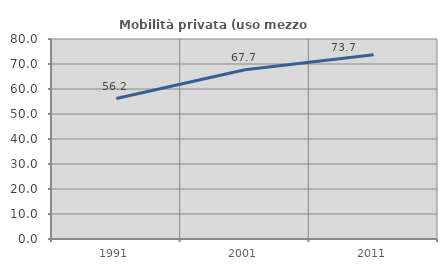
| Category | Mobilità privata (uso mezzo privato) |
|---|---|
| 1991.0 | 56.173 |
| 2001.0 | 67.699 |
| 2011.0 | 73.684 |